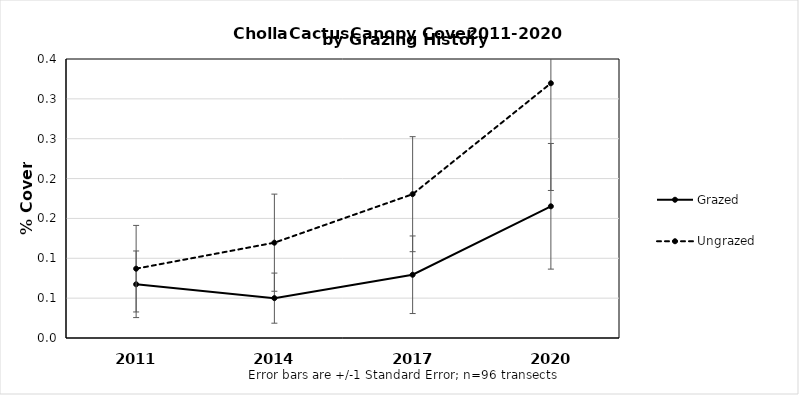
| Category | Grazed | Ungrazed |
|---|---|---|
| 2011.0 | 0.067 | 0.087 |
| 2014.0 | 0.05 | 0.12 |
| 2017.0 | 0.079 | 0.18 |
| 2020.0 | 0.165 | 0.32 |